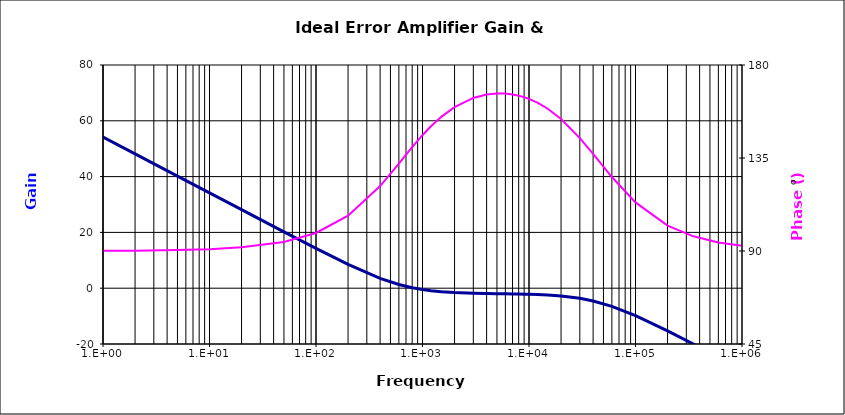
| Category | Error Amplifier Gain |
|---|---|
| 1.0 | 54.153 |
| 2.0 | 48.132 |
| 5.0 | 40.174 |
| 10.0 | 34.154 |
| 20.0 | 28.136 |
| 50.0 | 20.2 |
| 100.0 | 14.257 |
| 200.0 | 8.535 |
| 400.0 | 3.539 |
| 600.0 | 1.32 |
| 800.0 | 0.166 |
| 1000.0 | -0.494 |
| 1200.0 | -0.9 |
| 1500.0 | -1.264 |
| 2000.0 | -1.571 |
| 3000.0 | -1.813 |
| 4000.0 | -1.913 |
| 5000.0 | -1.972 |
| 6000.0 | -2.017 |
| 7000.0 | -2.059 |
| 8000.0 | -2.099 |
| 9000.0 | -2.142 |
| 10000.0 | -2.186 |
| 12000.0 | -2.283 |
| 15000.0 | -2.452 |
| 20000.0 | -2.791 |
| 30000.0 | -3.628 |
| 40000.0 | -4.581 |
| 60000.0 | -6.519 |
| 100000.0 | -9.846 |
| 200000.0 | -15.298 |
| 350000.0 | -20.02 |
| 600000.0 | -24.657 |
| 1000000.0 | -29.079 |